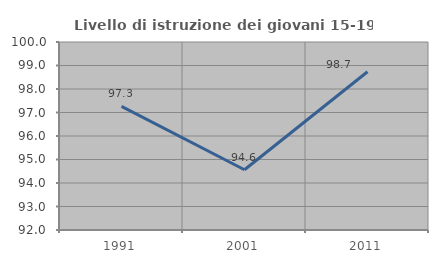
| Category | Livello di istruzione dei giovani 15-19 anni |
|---|---|
| 1991.0 | 97.26 |
| 2001.0 | 94.565 |
| 2011.0 | 98.734 |